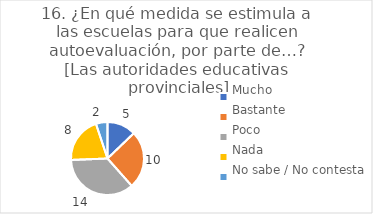
| Category | 16. ¿En qué medida se estimula a las escuelas para que realicen autoevaluación, por parte de…?
[Las autoridades educativas provinciales] |
|---|---|
| Mucho  | 0.128 |
| Bastante  | 0.256 |
| Poco  | 0.359 |
| Nada  | 0.205 |
| No sabe / No contesta | 0.051 |